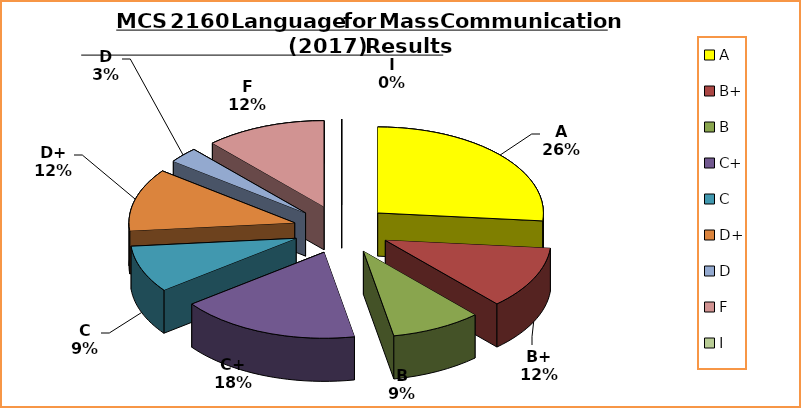
| Category | Series 0 |
|---|---|
| A | 9 |
| B+ | 4 |
| B | 3 |
| C+ | 6 |
| C | 3 |
| D+ | 4 |
| D | 1 |
| F | 4 |
| I | 0 |